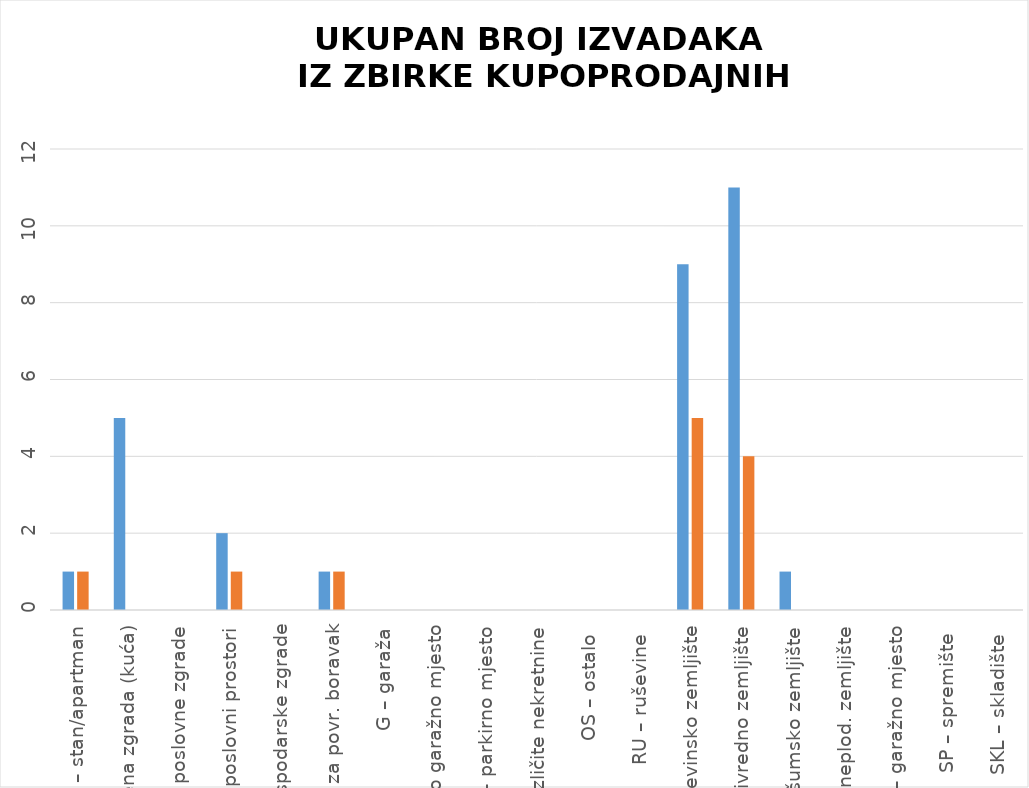
| Category | BROJ IZDANIH IZVADAKA - Zahtjev predan u eNekretninama | BROJ IZDANIH IZVADAKA -  
Zahtjev predan osobno |
|---|---|---|
| ST – stan/apartman | 1 | 1 |
| OK – stambena zgrada (kuća) | 5 | 0 |
| PZG – poslovne zgrade | 0 | 0 |
| PP – poslovni prostori | 2 | 1 |
| GZG – gospodarske zgrade | 0 | 0 |
| VIK – nekretn. za povr. boravak | 1 | 1 |
| G – garaža | 0 | 0 |
| PGM – parkirno garažno mjesto | 0 | 0 |
| VPM – parkirno mjesto | 0 | 0 |
| RN – različite nekretnine | 0 | 0 |
| OS – ostalo  | 0 | 0 |
| RU – ruševine  | 0 | 0 |
| GZ – građevinsko zemljište | 9 | 5 |
| PZ – poljoprivredno zemljište | 11 | 4 |
| ŠZ – šumsko zemljište | 1 | 0 |
| PNZ – prirodno neplod. zemljište | 0 | 0 |
| GM – garažno mjesto | 0 | 0 |
| SP – spremište  | 0 | 0 |
| SKL – skladište  | 0 | 0 |